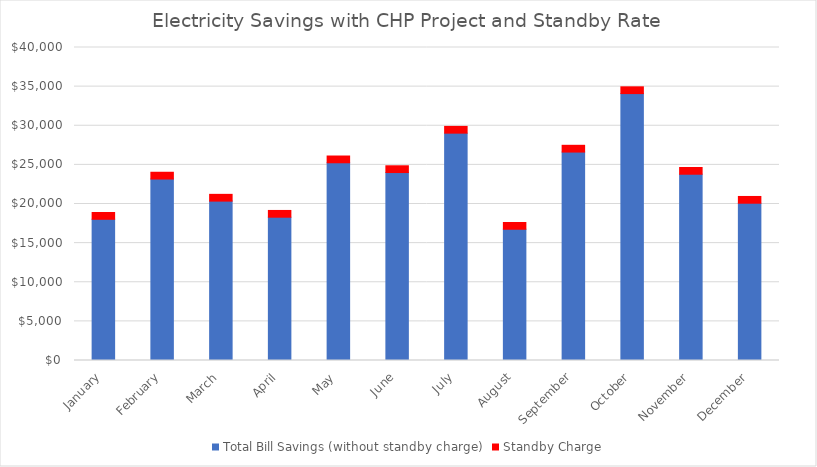
| Category | Total Bill Savings (without standby charge) | Standby Charge |
|---|---|---|
| January | 18046.846 | 863.725 |
| February | 23192.923 | 863.725 |
| March | 20368.934 | 863.725 |
| April | 18312.131 | 863.725 |
| May | 25269.193 | 863.725 |
| June | 24020.281 | 863.725 |
| July | 29053.272 | 863.725 |
| August | 16774.219 | 863.725 |
| September | 26637.564 | 863.725 |
| October | 34109.977 | 863.725 |
| November | 23803.664 | 863.725 |
| December | 20099.401 | 863.725 |